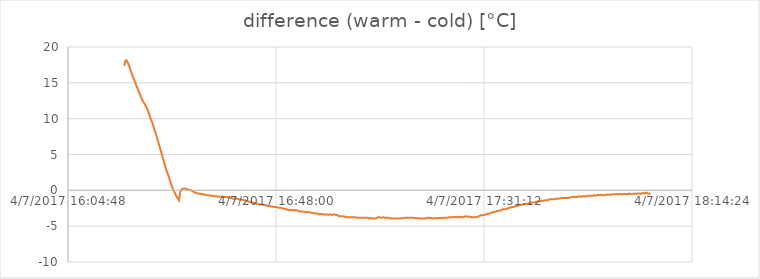
| Category | difference (warm - cold) [°C] |
|---|---|
| 42920.67811342593 | 17.38 |
| 42920.678298611114 | 18.13 |
| 42920.67847222222 | 18.12 |
| 42920.67864583333 | 17.75 |
| 42920.67883101852 | 17.31 |
| 42920.67900462963 | 16.75 |
| 42920.67917824074 | 16.38 |
| 42920.67936342592 | 15.81 |
| 42920.67953703704 | 15.44 |
| 42920.679710648146 | 15 |
| 42920.67990740741 | 14.5 |
| 42920.680081018516 | 14.07 |
| 42920.6802662037 | 13.63 |
| 42920.680439814816 | 13.25 |
| 42920.680625 | 12.75 |
| 42920.68079861111 | 12.44 |
| 42920.680972222224 | 12.19 |
| 42920.68115740741 | 11.88 |
| 42920.681342592594 | 11.5 |
| 42920.68152777778 | 11.13 |
| 42920.68170138889 | 10.63 |
| 42920.68188657407 | 10.07 |
| 42920.68206018519 | 9.63 |
| 42920.682233796295 | 9.18 |
| 42920.68241898148 | 8.62 |
| 42920.682592592595 | 8.13 |
| 42920.6827662037 | 7.62 |
| 42920.68295138889 | 6.94 |
| 42920.683125 | 6.37 |
| 42920.68329861111 | 5.81 |
| 42920.68347222222 | 5.25 |
| 42920.683657407404 | 4.56 |
| 42920.68383101852 | 4 |
| 42920.684016203704 | 3.38 |
| 42920.68418981481 | 2.81 |
| 42920.68436342593 | 2.37 |
| 42920.68456018518 | 1.81 |
| 42920.684745370374 | 1.19 |
| 42920.68491898148 | 0.75 |
| 42920.685115740744 | 0.19 |
| 42920.68530092593 | -0.18 |
| 42920.68547453704 | -0.49 |
| 42920.685648148145 | -0.87 |
| 42920.68583333334 | -1.06 |
| 42920.686006944445 | -1.37 |
| 42920.68618055555 | -0.25 |
| 42920.68636574074 | 0.13 |
| 42920.68653935185 | 0.19 |
| 42920.68671296296 | 0.25 |
| 42920.686898148146 | 0.25 |
| 42920.68707175926 | 0.19 |
| 42920.68724537037 | 0.12 |
| 42920.68744212963 | 0.06 |
| 42920.687627314815 | 0 |
| 42920.68780092592 | 0 |
| 42920.687997685185 | -0.13 |
| 42920.68818287037 | -0.25 |
| 42920.68835648148 | -0.31 |
| 42920.68853009259 | -0.38 |
| 42920.68871527778 | -0.44 |
| 42920.688888888886 | -0.44 |
| 42920.6890625 | -0.5 |
| 42920.689259259256 | -0.5 |
| 42920.68944444445 | -0.57 |
| 42920.689618055556 | -0.56 |
| 42920.689791666664 | -0.62 |
| 42920.68997685185 | -0.68 |
| 42920.690150462964 | -0.68 |
| 42920.69032407407 | -0.68 |
| 42920.69050925926 | -0.75 |
| 42920.69068287037 | -0.75 |
| 42920.69085648148 | -0.75 |
| 42920.691030092596 | -0.81 |
| 42920.69121527778 | -0.81 |
| 42920.69138888889 | -0.81 |
| 42920.69157407407 | -0.88 |
| 42920.69175925926 | -0.88 |
| 42920.69194444444 | -0.88 |
| 42920.692141203705 | -0.87 |
| 42920.69232638889 | -0.93 |
| 42920.6925 | -0.93 |
| 42920.69267361111 | -0.94 |
| 42920.6928587963 | -0.94 |
| 42920.693032407406 | -0.94 |
| 42920.69320601852 | -1 |
| 42920.693391203706 | -1.06 |
| 42920.693564814814 | -1.07 |
| 42920.69373842593 | -1.13 |
| 42920.693923611114 | -1.19 |
| 42920.69409722222 | -1.12 |
| 42920.69427083333 | -1.18 |
| 42920.69445601852 | -1.19 |
| 42920.69462962963 | -1.25 |
| 42920.69480324074 | -1.31 |
| 42920.69498842592 | -1.25 |
| 42920.69516203704 | -1.31 |
| 42920.695335648146 | -1.38 |
| 42920.69553240741 | -1.38 |
| 42920.69571759259 | -1.5 |
| 42920.6958912037 | -1.5 |
| 42920.696064814816 | -1.56 |
| 42920.69625 | -1.62 |
| 42920.69642361111 | -1.62 |
| 42920.696597222224 | -1.69 |
| 42920.69678240741 | -1.75 |
| 42920.69695601852 | -1.75 |
| 42920.69712962963 | -1.81 |
| 42920.69732638889 | -1.88 |
| 42920.69751157407 | -1.94 |
| 42920.69768518519 | -2 |
| 42920.69787037037 | -1.93 |
| 42920.69804398148 | -2 |
| 42920.698217592595 | -2.06 |
| 42920.69840277778 | -2.06 |
| 42920.69857638889 | -2.12 |
| 42920.69875 | -2.13 |
| 42920.69893518519 | -2.19 |
| 42920.699108796296 | -2.19 |
| 42920.699282407404 | -2.25 |
| 42920.699479166666 | -2.25 |
| 42920.69966435185 | -2.31 |
| 42920.699837962966 | -2.31 |
| 42920.700011574074 | -2.31 |
| 42920.70019675926 | -2.37 |
| 42920.700370370374 | -2.44 |
| 42920.70054398148 | -2.44 |
| 42920.70072916667 | -2.44 |
| 42920.700902777775 | -2.5 |
| 42920.70107638889 | -2.57 |
| 42920.701261574075 | -2.56 |
| 42920.70143518518 | -2.62 |
| 42920.7016087963 | -2.68 |
| 42920.70179398148 | -2.75 |
| 42920.70196759259 | -2.69 |
| 42920.70214120371 | -2.81 |
| 42920.70232638889 | -2.75 |
| 42920.7025 | -2.75 |
| 42920.702673611115 | -2.82 |
| 42920.70287037037 | -2.75 |
| 42920.703055555554 | -2.81 |
| 42920.70322916667 | -2.87 |
| 42920.70342592592 | -2.94 |
| 42920.70361111111 | -2.94 |
| 42920.703784722224 | -2.94 |
| 42920.70395833333 | -3 |
| 42920.70414351852 | -3 |
| 42920.70431712963 | -3.07 |
| 42920.70449074074 | -3 |
| 42920.704675925925 | -3.06 |
| 42920.70484953704 | -3.06 |
| 42920.70502314815 | -3.12 |
| 42920.70520833333 | -3.13 |
| 42920.70538194444 | -3.19 |
| 42920.705555555556 | -3.19 |
| 42920.70575231482 | -3.19 |
| 42920.7059375 | -3.25 |
| 42920.70611111111 | -3.31 |
| 42920.70628472222 | -3.37 |
| 42920.70648148148 | -3.31 |
| 42920.70664351852 | -3.31 |
| 42920.70684027778 | -3.38 |
| 42920.707037037035 | -3.38 |
| 42920.70722222222 | -3.37 |
| 42920.707395833335 | -3.37 |
| 42920.70758101852 | -3.43 |
| 42920.70775462963 | -3.37 |
| 42920.70792824074 | -3.38 |
| 42920.70811342593 | -3.44 |
| 42920.708287037036 | -3.38 |
| 42920.70847222222 | -3.37 |
| 42920.708645833336 | -3.43 |
| 42920.708819444444 | -3.44 |
| 42920.70899305555 | -3.56 |
| 42920.709178240744 | -3.62 |
| 42920.70935185185 | -3.63 |
| 42920.70952546296 | -3.63 |
| 42920.709710648145 | -3.62 |
| 42920.70988425926 | -3.68 |
| 42920.71005787037 | -3.69 |
| 42920.71024305555 | -3.75 |
| 42920.71041666667 | -3.75 |
| 42920.71059027778 | -3.76 |
| 42920.71077546296 | -3.76 |
| 42920.71094907408 | -3.75 |
| 42920.711122685185 | -3.75 |
| 42920.71130787037 | -3.75 |
| 42920.711481481485 | -3.75 |
| 42920.71165509259 | -3.82 |
| 42920.711851851855 | -3.82 |
| 42920.71204861111 | -3.81 |
| 42920.712233796294 | -3.81 |
| 42920.71240740741 | -3.82 |
| 42920.71260416666 | -3.82 |
| 42920.712789351855 | -3.81 |
| 42920.71296296296 | -3.81 |
| 42920.71313657407 | -3.82 |
| 42920.713321759256 | -3.88 |
| 42920.71349537037 | -3.88 |
| 42920.713692129626 | -3.87 |
| 42920.71387731482 | -3.94 |
| 42920.714050925926 | -3.94 |
| 42920.714224537034 | -3.94 |
| 42920.71440972222 | -3.94 |
| 42920.714583333334 | -3.81 |
| 42920.71475694444 | -3.75 |
| 42920.71494212963 | -3.75 |
| 42920.71511574074 | -3.82 |
| 42920.71528935185 | -3.82 |
| 42920.71548611111 | -3.75 |
| 42920.7156712963 | -3.81 |
| 42920.715844907405 | -3.82 |
| 42920.71601851852 | -3.82 |
| 42920.716203703705 | -3.81 |
| 42920.71637731481 | -3.88 |
| 42920.71655092593 | -3.88 |
| 42920.71674768518 | -3.94 |
| 42920.71693287037 | -3.94 |
| 42920.71710648148 | -3.94 |
| 42920.71730324074 | -3.94 |
| 42920.71748842593 | -3.94 |
| 42920.71766203704 | -3.94 |
| 42920.717835648145 | -3.94 |
| 42920.71800925926 | -3.88 |
| 42920.71818287037 | -3.88 |
| 42920.718356481484 | -3.88 |
| 42920.71854166667 | -3.81 |
| 42920.71871527778 | -3.81 |
| 42920.71888888889 | -3.82 |
| 42920.71907407408 | -3.82 |
| 42920.719247685185 | -3.81 |
| 42920.71942129629 | -3.81 |
| 42920.719618055555 | -3.82 |
| 42920.71980324074 | -3.82 |
| 42920.719976851855 | -3.87 |
| 42920.72017361111 | -3.87 |
| 42920.720358796294 | -3.88 |
| 42920.72053240741 | -3.88 |
| 42920.72070601852 | -3.94 |
| 42920.7208912037 | -3.94 |
| 42920.72106481482 | -3.94 |
| 42920.721238425926 | -3.94 |
| 42920.72142361111 | -3.94 |
| 42920.721597222226 | -3.88 |
| 42920.721770833334 | -3.88 |
| 42920.72195601852 | -3.81 |
| 42920.72212962963 | -3.82 |
| 42920.72230324074 | -3.88 |
| 42920.72248842593 | -3.87 |
| 42920.722662037035 | -3.94 |
| 42920.72283564815 | -3.88 |
| 42920.72300925926 | -3.87 |
| 42920.72319444444 | -3.93 |
| 42920.72336805556 | -3.88 |
| 42920.72356481481 | -3.87 |
| 42920.72372685185 | -3.87 |
| 42920.72390046297 | -3.88 |
| 42920.72409722222 | -3.81 |
| 42920.724282407406 | -3.87 |
| 42920.72445601852 | -3.82 |
| 42920.72462962963 | -3.81 |
| 42920.724814814814 | -3.81 |
| 42920.72498842593 | -3.75 |
| 42920.72516203704 | -3.75 |
| 42920.7253587963 | -3.75 |
| 42920.72554398148 | -3.75 |
| 42920.72571759259 | -3.69 |
| 42920.72589120371 | -3.74 |
| 42920.72608796296 | -3.75 |
| 42920.72625 | -3.68 |
| 42920.72642361111 | -3.75 |
| 42920.72662037037 | -3.68 |
| 42920.726805555554 | -3.75 |
| 42920.72697916667 | -3.75 |
| 42920.72715277778 | -3.69 |
| 42920.72734953704 | -3.62 |
| 42920.72752314815 | -3.63 |
| 42920.72770833333 | -3.69 |
| 42920.72788194445 | -3.69 |
| 42920.72806712963 | -3.69 |
| 42920.72824074074 | -3.75 |
| 42920.728425925925 | -3.75 |
| 42920.72861111111 | -3.75 |
| 42920.728784722225 | -3.75 |
| 42920.72896990741 | -3.69 |
| 42920.72914351852 | -3.69 |
| 42920.72934027778 | -3.56 |
| 42920.72951388889 | -3.49 |
| 42920.7296875 | -3.5 |
| 42920.72987268519 | -3.44 |
| 42920.730046296296 | -3.44 |
| 42920.730219907404 | -3.38 |
| 42920.730405092596 | -3.31 |
| 42920.730578703704 | -3.25 |
| 42920.73075231481 | -3.25 |
| 42920.7309375 | -3.19 |
| 42920.73111111111 | -3.06 |
| 42920.73138888889 | -3.06 |
| 42920.7315625 | -3 |
| 42920.73173611111 | -2.94 |
| 42920.7319212963 | -2.87 |
| 42920.732094907406 | -2.88 |
| 42920.73226851852 | -2.81 |
| 42920.73244212963 | -2.81 |
| 42920.732627314814 | -2.69 |
| 42920.73280092593 | -2.62 |
| 42920.73297453704 | -2.63 |
| 42920.73315972222 | -2.62 |
| 42920.73333333333 | -2.56 |
| 42920.73351851852 | -2.5 |
| 42920.73370370371 | -2.44 |
| 42920.733877314815 | -2.37 |
| 42920.73405092592 | -2.32 |
| 42920.734247685185 | -2.32 |
| 42920.73443287037 | -2.25 |
| 42920.734606481485 | -2.19 |
| 42920.73479166667 | -2.19 |
| 42920.734976851854 | -2.13 |
| 42920.73515046296 | -2.06 |
| 42920.73532407408 | -2 |
| 42920.735497685186 | -2 |
| 42920.73568287037 | -1.93 |
| 42920.73585648148 | -1.94 |
| 42920.736030092594 | -1.87 |
| 42920.7362037037 | -1.87 |
| 42920.73638888889 | -1.81 |
| 42920.7365625 | -1.81 |
| 42920.73674768519 | -1.75 |
| 42920.736921296295 | -1.69 |
| 42920.73709490741 | -1.69 |
| 42920.73726851852 | -1.68 |
| 42920.73746527778 | -1.63 |
| 42920.737650462965 | -1.56 |
| 42920.73782407407 | -1.56 |
| 42920.73799768519 | -1.56 |
| 42920.73818287037 | -1.5 |
| 42920.73835648148 | -1.44 |
| 42920.738530092596 | -1.44 |
| 42920.73871527778 | -1.43 |
| 42920.73888888889 | -1.38 |
| 42920.7390625 | -1.38 |
| 42920.73923611111 | -1.37 |
| 42920.7394212963 | -1.25 |
| 42920.73961805556 | -1.25 |
| 42920.739803240744 | -1.25 |
| 42920.73997685185 | -1.25 |
| 42920.74015046296 | -1.25 |
| 42920.740324074075 | -1.19 |
| 42920.74049768518 | -1.13 |
| 42920.7406712963 | -1.19 |
| 42920.74085648148 | -1.13 |
| 42920.74103009259 | -1.12 |
| 42920.74120370371 | -1.06 |
| 42920.74138888889 | -1.06 |
| 42920.7415625 | -1.07 |
| 42920.741747685184 | -1.07 |
| 42920.74193287037 | -1.06 |
| 42920.742106481484 | -1.06 |
| 42920.74229166667 | -1 |
| 42920.74246527778 | -1 |
| 42920.742638888885 | -0.93 |
| 42920.74282407408 | -0.94 |
| 42920.742997685185 | -0.88 |
| 42920.74317129629 | -0.94 |
| 42920.743368055555 | -0.94 |
| 42920.74355324074 | -0.87 |
| 42920.743726851855 | -0.87 |
| 42920.74390046296 | -0.87 |
| 42920.74407407407 | -0.88 |
| 42920.74427083333 | -0.81 |
| 42920.744467592594 | -0.87 |
| 42920.74465277778 | -0.81 |
| 42920.744837962964 | -0.81 |
| 42920.74501157407 | -0.75 |
| 42920.74519675926 | -0.75 |
| 42920.74537037037 | -0.75 |
| 42920.74554398148 | -0.75 |
| 42920.74574074074 | -0.75 |
| 42920.7459375 | -0.69 |
| 42920.74612268519 | -0.75 |
| 42920.746296296296 | -0.69 |
| 42920.74649305556 | -0.63 |
| 42920.74667824074 | -0.69 |
| 42920.74685185185 | -0.62 |
| 42920.747025462966 | -0.69 |
| 42920.747199074074 | -0.63 |
| 42920.74737268518 | -0.69 |
| 42920.74755787037 | -0.63 |
| 42920.74773148148 | -0.63 |
| 42920.74790509259 | -0.57 |
| 42920.748078703706 | -0.63 |
| 42920.74826388889 | -0.63 |
| 42920.7484375 | -0.56 |
| 42920.748611111114 | -0.56 |
| 42920.74880787037 | -0.56 |
| 42920.74899305555 | -0.56 |
| 42920.74916666667 | -0.5 |
| 42920.749340277776 | -0.56 |
| 42920.74953703704 | -0.5 |
| 42920.749710648146 | -0.5 |
| 42920.74988425926 | -0.57 |
| 42920.750069444446 | -0.5 |
| 42920.750243055554 | -0.5 |
| 42920.75042824074 | -0.5 |
| 42920.750613425924 | -0.5 |
| 42920.75078703704 | -0.56 |
| 42920.75096064815 | -0.44 |
| 42920.75113425926 | -0.5 |
| 42920.75130787037 | -0.5 |
| 42920.75148148148 | -0.49 |
| 42920.751655092594 | -0.49 |
| 42920.75184027778 | -0.43 |
| 42920.75201388889 | -0.49 |
| 42920.75219907407 | -0.43 |
| 42920.75237268519 | -0.43 |
| 42920.752546296295 | -0.5 |
| 42920.75273148148 | -0.44 |
| 42920.752905092595 | -0.37 |
| 42920.7530787037 | -0.44 |
| 42920.75326388889 | -0.38 |
| 42920.7534375 | -0.31 |
| 42920.75361111111 | -0.44 |
| 42920.75380787037 | -0.5 |
| 42920.75399305556 | -0.38 |